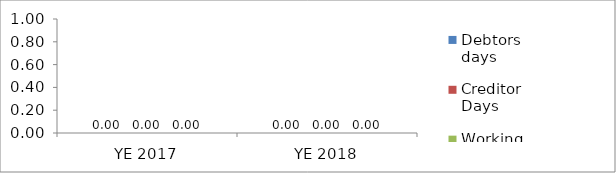
| Category | Debtors days | Creditor Days | Working Capital Days |
|---|---|---|---|
| YE 2017 | 0 | 0 | 0 |
| YE 2018 | 0 | 0 | 0 |